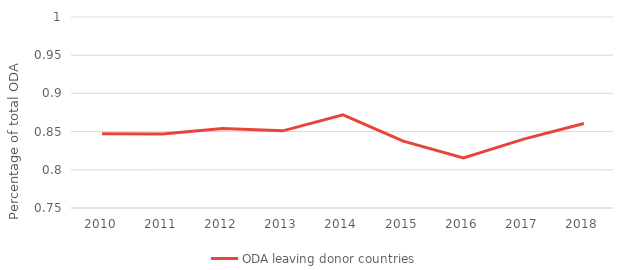
| Category | ODA leaving donor countries |
|---|---|
| 2010.0 | 0.847 |
| 2011.0 | 0.847 |
| 2012.0 | 0.854 |
| 2013.0 | 0.851 |
| 2014.0 | 0.872 |
| 2015.0 | 0.838 |
| 2016.0 | 0.816 |
| 2017.0 | 0.84 |
| 2018.0 | 0.861 |